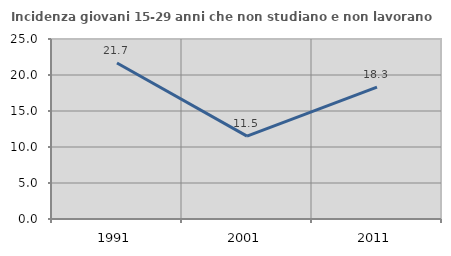
| Category | Incidenza giovani 15-29 anni che non studiano e non lavorano  |
|---|---|
| 1991.0 | 21.674 |
| 2001.0 | 11.505 |
| 2011.0 | 18.326 |